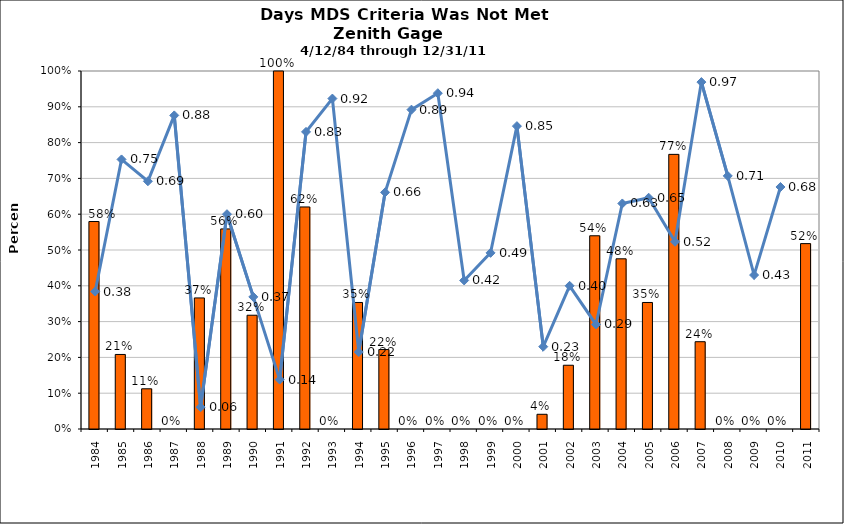
| Category | Zenith |
|---|---|
| 1984.0 | 0.58 |
| 1985.0 | 0.208 |
| 1986.0 | 0.112 |
| 1987.0 | 0 |
| 1988.0 | 0.366 |
| 1989.0 | 0.559 |
| 1990.0 | 0.318 |
| 1991.0 | 1 |
| 1992.0 | 0.62 |
| 1993.0 | 0 |
| 1994.0 | 0.353 |
| 1995.0 | 0.222 |
| 1996.0 | 0 |
| 1997.0 | 0 |
| 1998.0 | 0 |
| 1999.0 | 0 |
| 2000.0 | 0 |
| 2001.0 | 0.041 |
| 2002.0 | 0.178 |
| 2003.0 | 0.54 |
| 2004.0 | 0.475 |
| 2005.0 | 0.353 |
| 2006.0 | 0.767 |
| 2007.0 | 0.244 |
| 2008.0 | 0 |
| 2009.0 | 0 |
| 2010.0 | 0 |
| 2011.0 | 0.518 |